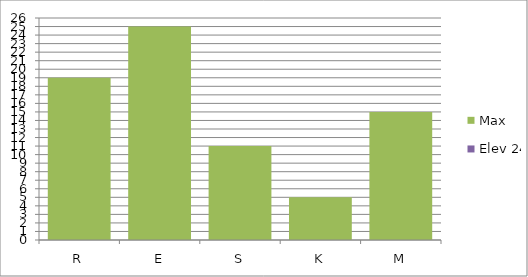
| Category | Max | Elev 24 |
|---|---|---|
| R | 19 | 0 |
| E | 25 | 0 |
| S | 11 | 0 |
| K | 5 | 0 |
| M | 15 | 0 |